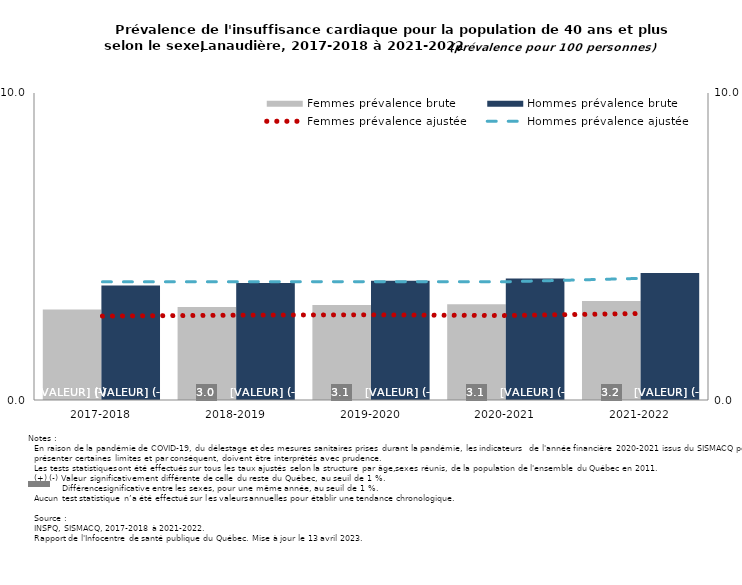
| Category | Femmes prévalence brute | Hommes prévalence brute |
|---|---|---|
| 2017-2018 | 2.949 | 3.73 |
| 2018-2019 | 3.03 | 3.815 |
| 2019-2020 | 3.091 | 3.884 |
| 2020-2021 | 3.117 | 3.961 |
| 2021-2022 | 3.226 | 4.137 |